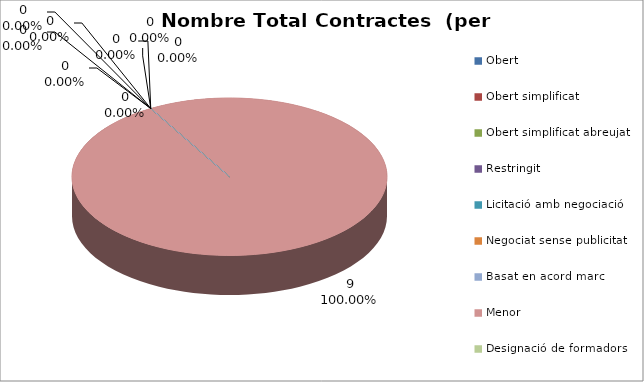
| Category | Nombre Total Contractes |
|---|---|
| Obert | 0 |
| Obert simplificat | 0 |
| Obert simplificat abreujat | 0 |
| Restringit | 0 |
| Licitació amb negociació | 0 |
| Negociat sense publicitat | 0 |
| Basat en acord marc | 0 |
| Menor | 9 |
| Designació de formadors | 0 |